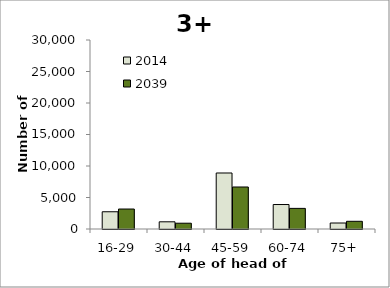
| Category | 2014 | 2039 |
|---|---|---|
| 16-29 | 2738 | 3171 |
| 30-44 | 1141 | 920 |
| 45-59 | 8889 | 6669 |
| 60-74 | 3886 | 3272 |
| 75+ | 952 | 1222 |